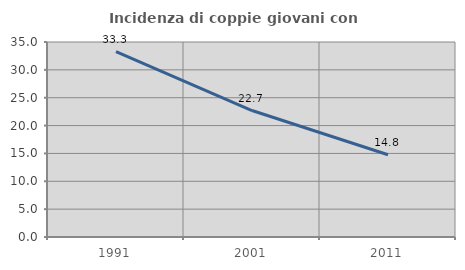
| Category | Incidenza di coppie giovani con figli |
|---|---|
| 1991.0 | 33.292 |
| 2001.0 | 22.704 |
| 2011.0 | 14.759 |